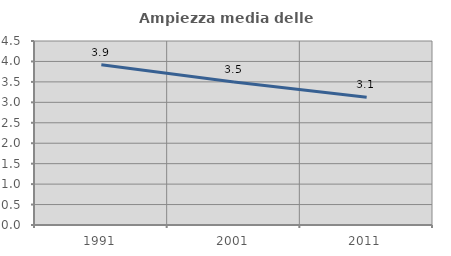
| Category | Ampiezza media delle famiglie |
|---|---|
| 1991.0 | 3.921 |
| 2001.0 | 3.496 |
| 2011.0 | 3.127 |